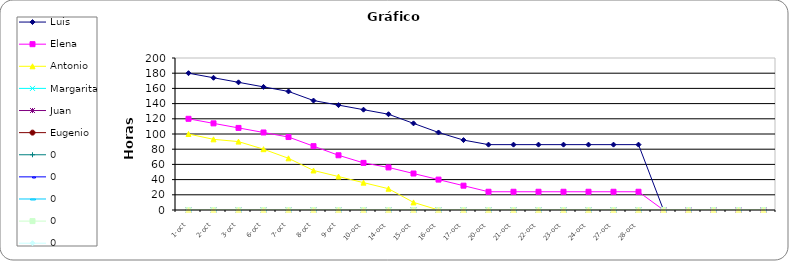
| Category | Luis | Elena | Antonio | Margarita | Juan | Eugenio | 0 |
|---|---|---|---|---|---|---|---|
| 1-oct. | 180 | 120 | 100 | 0 | 0 | 0 | 0 |
| 2-oct. | 174 | 114 | 93 | 0 | 0 | 0 | 0 |
| 3-oct. | 168 | 108 | 90 | 0 | 0 | 0 | 0 |
| 6-oct. | 162 | 102 | 80 | 0 | 0 | 0 | 0 |
| 7-oct. | 156 | 96 | 68 | 0 | 0 | 0 | 0 |
| 8-oct. | 144 | 84 | 52 | 0 | 0 | 0 | 0 |
| 9-oct. | 138 | 72 | 44 | 0 | 0 | 0 | 0 |
| 10-oct. | 132 | 62 | 36 | 0 | 0 | 0 | 0 |
| 14-oct. | 126 | 56 | 28 | 0 | 0 | 0 | 0 |
| 15-oct. | 114 | 48 | 10 | 0 | 0 | 0 | 0 |
| 16-oct. | 102 | 40 | 0 | 0 | 0 | 0 | 0 |
| 17-oct. | 92 | 32 | 0 | 0 | 0 | 0 | 0 |
| 20-oct. | 86 | 24 | 0 | 0 | 0 | 0 | 0 |
| 21-oct. | 86 | 24 | 0 | 0 | 0 | 0 | 0 |
| 22-oct. | 86 | 24 | 0 | 0 | 0 | 0 | 0 |
| 23-oct. | 86 | 24 | 0 | 0 | 0 | 0 | 0 |
| 24-oct. | 86 | 24 | 0 | 0 | 0 | 0 | 0 |
| 27-oct. | 86 | 24 | 0 | 0 | 0 | 0 | 0 |
| 28-oct. | 86 | 24 | 0 | 0 | 0 | 0 | 0 |